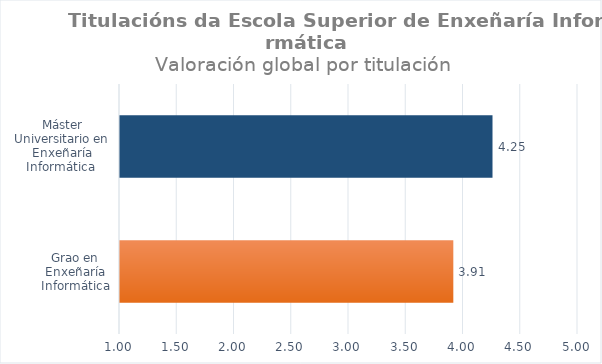
| Category | Series 0 |
|---|---|
| Grao en Enxeñaría Informática | 3.911 |
| Máster Universitario en Enxeñaría Informática  | 4.253 |